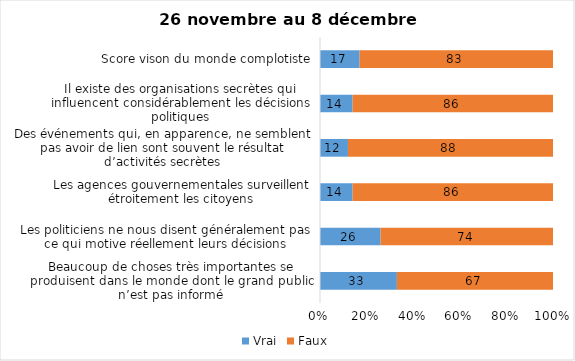
| Category | Vrai | Faux |
|---|---|---|
| Beaucoup de choses très importantes se produisent dans le monde dont le grand public n’est pas informé | 33 | 67 |
| Les politiciens ne nous disent généralement pas ce qui motive réellement leurs décisions | 26 | 74 |
| Les agences gouvernementales surveillent étroitement les citoyens | 14 | 86 |
| Des événements qui, en apparence, ne semblent pas avoir de lien sont souvent le résultat d’activités secrètes | 12 | 88 |
| Il existe des organisations secrètes qui influencent considérablement les décisions politiques | 14 | 86 |
| Score vison du monde complotiste | 17 | 83 |